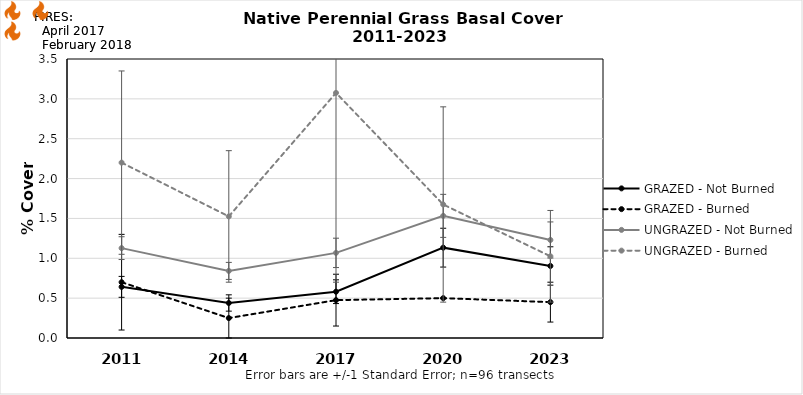
| Category | GRAZED - Not Burned | GRAZED - Burned | UNGRAZED - Not Burned | UNGRAZED - Burned |
|---|---|---|---|---|
| 2011.0 | 0.642 | 0.7 | 1.127 | 2.2 |
| 2014.0 | 0.439 | 0.25 | 0.842 | 1.525 |
| 2017.0 | 0.581 | 0.475 | 1.068 | 3.075 |
| 2020.0 | 1.133 | 0.5 | 1.532 | 1.675 |
| 2023.0 | 0.904 | 0.45 | 1.23 | 1.025 |